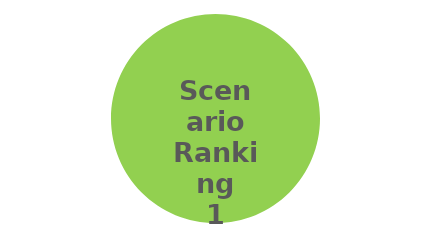
| Category | Scenario Ranking |
|---|---|
| 0 | 1 |